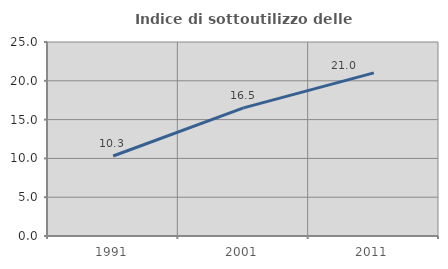
| Category | Indice di sottoutilizzo delle abitazioni  |
|---|---|
| 1991.0 | 10.311 |
| 2001.0 | 16.514 |
| 2011.0 | 21.016 |